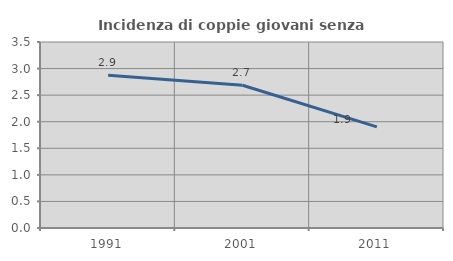
| Category | Incidenza di coppie giovani senza figli |
|---|---|
| 1991.0 | 2.874 |
| 2001.0 | 2.686 |
| 2011.0 | 1.903 |